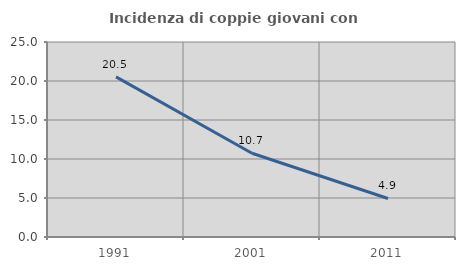
| Category | Incidenza di coppie giovani con figli |
|---|---|
| 1991.0 | 20.526 |
| 2001.0 | 10.734 |
| 2011.0 | 4.938 |